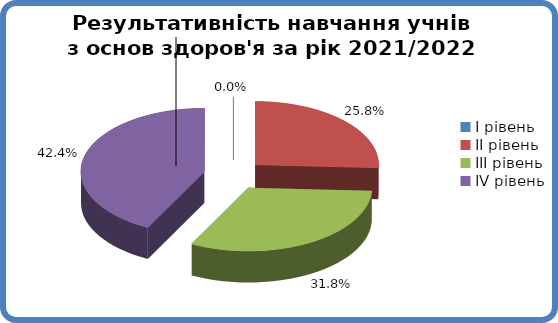
| Category | Series 0 |
|---|---|
| 0 | 0 |
| 1 | 0.258 |
| 2 | 0.318 |
| 3 | 0.424 |